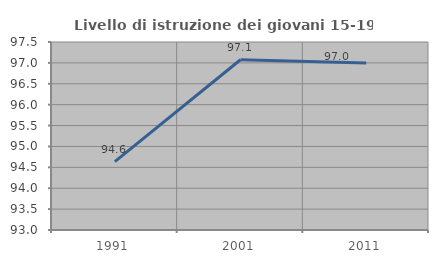
| Category | Livello di istruzione dei giovani 15-19 anni |
|---|---|
| 1991.0 | 94.635 |
| 2001.0 | 97.075 |
| 2011.0 | 96.997 |